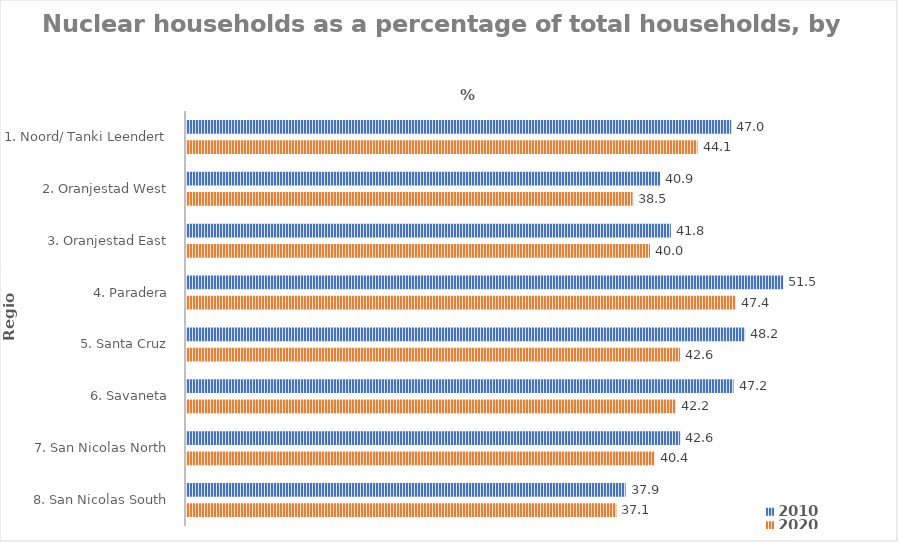
| Category | 2010 | 2020 |
|---|---|---|
| 1. Noord/ Tanki Leendert | 47 | 44.1 |
| 2. Oranjestad West | 40.9 | 38.5 |
| 3. Oranjestad East | 41.8 | 40 |
| 4. Paradera | 51.5 | 47.4 |
| 5. Santa Cruz | 48.2 | 42.6 |
| 6. Savaneta | 47.2 | 42.2 |
| 7. San Nicolas North | 42.6 | 40.4 |
| 8. San Nicolas South | 37.9 | 37.1 |